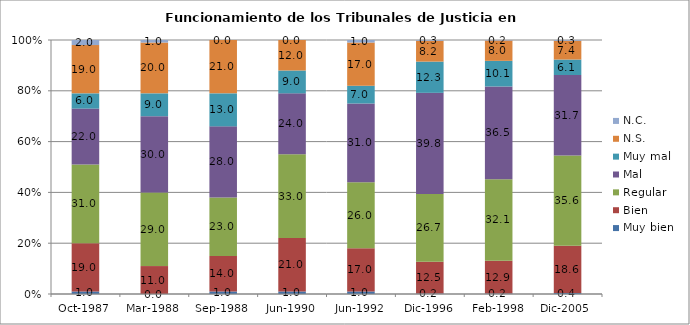
| Category | Muy bien | Bien | Regular | Mal | Muy mal | N.S. | N.C. |
|---|---|---|---|---|---|---|---|
| Oct-1987 | 1 | 19 | 31 | 22 | 6 | 19 | 2 |
| Mar-1988 | 0 | 11 | 29 | 30 | 9 | 20 | 1 |
| Sep-1988 | 1 | 14 | 23 | 28 | 13 | 21 | 0 |
| Jun-1990 | 1 | 21 | 33 | 24 | 9 | 12 | 0 |
| Jun-1992 | 1 | 17 | 26 | 31 | 7 | 17 | 1 |
| Dic-1996 | 0.2 | 12.5 | 26.7 | 39.8 | 12.3 | 8.2 | 0.3 |
| Feb-1998 | 0.2 | 12.9 | 32.1 | 36.5 | 10.1 | 8 | 0.2 |
| Dic-2005  | 0.4 | 18.6 | 35.6 | 31.7 | 6.1 | 7.4 | 0.3 |